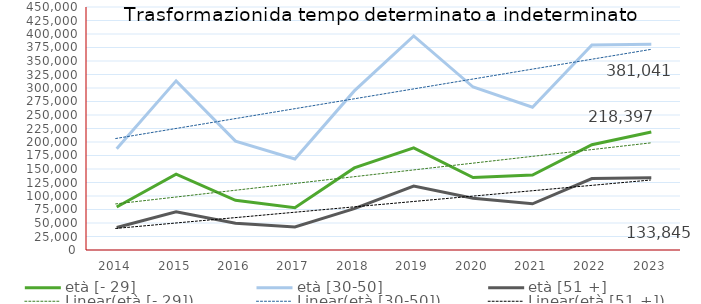
| Category | età [- 29] | età [30-50] | età [51 +] |
|---|---|---|---|
| 2014.0 | 79565 | 187362 | 41678 |
| 2015.0 | 140599 | 313218 | 70602 |
| 2016.0 | 92032 | 201722 | 49543 |
| 2017.0 | 78354 | 168505 | 42809 |
| 2018.0 | 151956 | 294646 | 76485 |
| 2019.0 | 189113 | 396399 | 118388 |
| 2020.0 | 134317 | 301804 | 95962 |
| 2021.0 | 138921 | 264500 | 85561 |
| 2022.0 | 195069 | 379514 | 132333 |
| 2023.0 | 218397 | 381041 | 133845 |